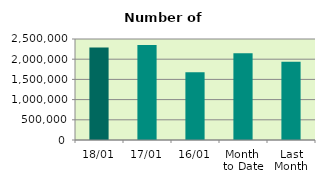
| Category | Series 0 |
|---|---|
| 18/01 | 2288568 |
| 17/01 | 2352174 |
| 16/01 | 1676482 |
| Month 
to Date | 2145810.615 |
| Last
Month | 1934937.048 |